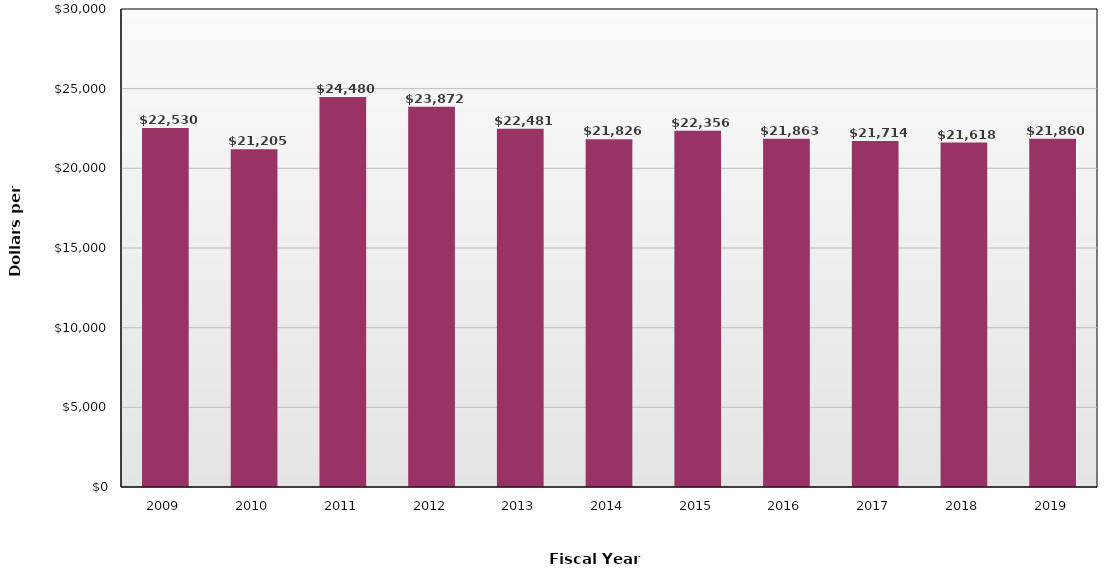
| Category | Dollars per FTE |
|---|---|
| 2009.0 | 22530 |
| 2010.0 | 21205 |
| 2011.0 | 24480 |
| 2012.0 | 23872 |
| 2013.0 | 22481 |
| 2014.0 | 21826 |
| 2015.0 | 22356 |
| 2016.0 | 21863 |
| 2017.0 | 21714 |
| 2018.0 | 21618 |
| 2019.0 | 21860 |